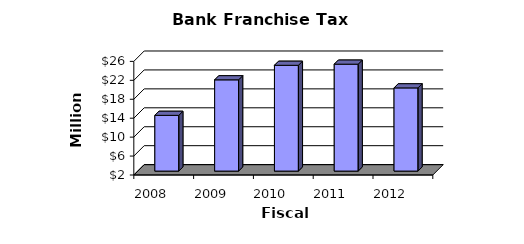
| Category | Series 0 |
|---|---|
| 2008.0 | 13770000 |
| 2009.0 | 21273000 |
| 2010.0 | 24343000 |
| 2011.0 | 24580000 |
| 2012.0 | 19570000 |